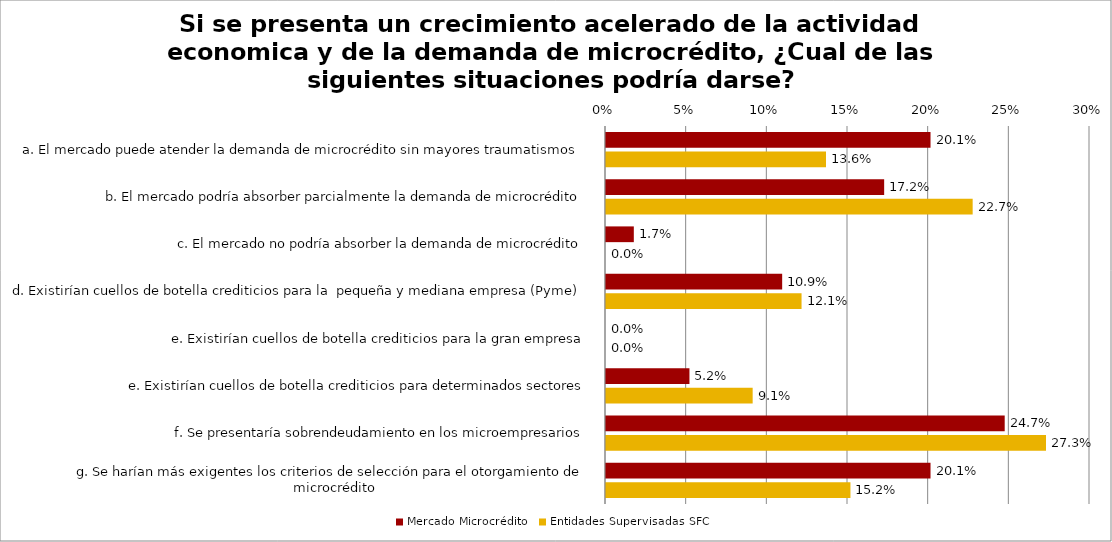
| Category | Mercado Microcrédito | Entidades Supervisadas SFC |
|---|---|---|
| a. El mercado puede atender la demanda de microcrédito sin mayores traumatismos | 0.201 | 0.136 |
| b. El mercado podría absorber parcialmente la demanda de microcrédito | 0.172 | 0.227 |
| c. El mercado no podría absorber la demanda de microcrédito | 0.017 | 0 |
| d. Existirían cuellos de botella crediticios para la  pequeña y mediana empresa (Pyme) | 0.109 | 0.121 |
| e. Existirían cuellos de botella crediticios para la gran empresa | 0 | 0 |
| e. Existirían cuellos de botella crediticios para determinados sectores | 0.052 | 0.091 |
| f. Se presentaría sobrendeudamiento en los microempresarios | 0.247 | 0.273 |
| g. Se harían más exigentes los criterios de selección para el otorgamiento de microcrédito | 0.201 | 0.152 |